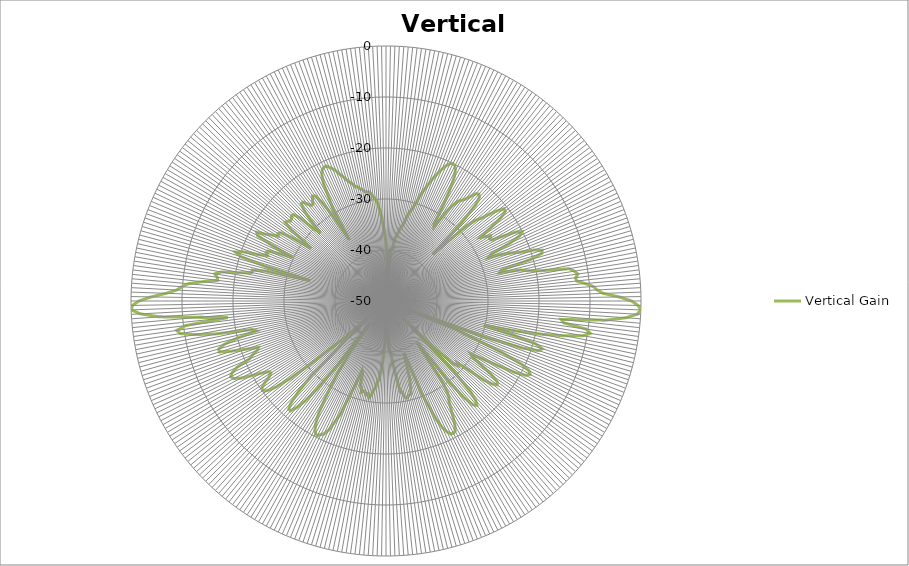
| Category | Vertical Gain |
|---|---|
| 0 | -38.65 |
| 1 | -40.9 |
| 2 | -42.72 |
| 3 | -45.24 |
| 4 | -43.29 |
| 5 | -42.2 |
| 6 | -40.06 |
| 7 | -39.79 |
| 8 | -37.65 |
| 9 | -37.22 |
| 10 | -36.46 |
| 11 | -35.47 |
| 12 | -35.03 |
| 13 | -34.24 |
| 14 | -32.79 |
| 15 | -31.89 |
| 16 | -31.13 |
| 17 | -29.9 |
| 18 | -28.16 |
| 19 | -26.88 |
| 20 | -25.56 |
| 21 | -24.2 |
| 22 | -23.07 |
| 23 | -21.92 |
| 24 | -20.94 |
| 25 | -20.27 |
| 26 | -20.04 |
| 27 | -20.2 |
| 28 | -21.03 |
| 29 | -22.54 |
| 30 | -25.25 |
| 31 | -28.61 |
| 32 | -32.25 |
| 33 | -32.7 |
| 34 | -28.99 |
| 35 | -26.95 |
| 36 | -25.77 |
| 37 | -25.26 |
| 38 | -24.6 |
| 39 | -23.56 |
| 40 | -22.53 |
| 41 | -22.24 |
| 42 | -22.63 |
| 43 | -24.22 |
| 44 | -28.56 |
| 45 | -37.03 |
| 46 | -33.48 |
| 47 | -28.42 |
| 48 | -26.29 |
| 49 | -25.28 |
| 50 | -23.5 |
| 51 | -21.83 |
| 52 | -20.63 |
| 53 | -20.7 |
| 54 | -22.04 |
| 55 | -24.86 |
| 56 | -27.71 |
| 57 | -26.84 |
| 58 | -25.83 |
| 59 | -26.32 |
| 60 | -26.06 |
| 61 | -23.8 |
| 62 | -21.26 |
| 63 | -20.08 |
| 64 | -20.81 |
| 65 | -23.24 |
| 66 | -27.39 |
| 67 | -28.22 |
| 68 | -25.68 |
| 69 | -23.73 |
| 70 | -22.08 |
| 71 | -19.3 |
| 72 | -17.79 |
| 73 | -18.04 |
| 74 | -20.54 |
| 75 | -26.58 |
| 76 | -27.07 |
| 77 | -23.01 |
| 78 | -21.53 |
| 79 | -18.79 |
| 80 | -13.5 |
| 81 | -12.61 |
| 82 | -12 |
| 83 | -12.55 |
| 84 | -12.42 |
| 85 | -10.78 |
| 86 | -9.26 |
| 87 | -8.55 |
| 88 | -7.36 |
| 89 | -4.24 |
| 90 | -1.85 |
| 91 | -0.57 |
| 92 | 0 |
| 93 | -0.66 |
| 94 | -2.86 |
| 95 | -6.84 |
| 96 | -15.47 |
| 97 | -14.89 |
| 98 | -10.34 |
| 99 | -9.45 |
| 100 | -10.79 |
| 101 | -14.22 |
| 102 | -18.5 |
| 103 | -23.87 |
| 104 | -30.24 |
| 105 | -24.04 |
| 106 | -19.48 |
| 107 | -17.96 |
| 108 | -18.52 |
| 109 | -21.7 |
| 110 | -29.23 |
| 111 | -46.14 |
| 112 | -35.67 |
| 113 | -31.28 |
| 114 | -24.84 |
| 115 | -20.63 |
| 116 | -18.79 |
| 117 | -18.28 |
| 118 | -18.96 |
| 119 | -21.12 |
| 120 | -24.67 |
| 121 | -28.11 |
| 122 | -30.4 |
| 123 | -29.6 |
| 124 | -27.26 |
| 125 | -24.7 |
| 126 | -23.02 |
| 127 | -22.7 |
| 128 | -23.56 |
| 129 | -25.35 |
| 130 | -29.28 |
| 131 | -31.53 |
| 132 | -31.02 |
| 133 | -31.82 |
| 134 | -36.45 |
| 135 | -45.29 |
| 136 | -31.23 |
| 137 | -25.68 |
| 138 | -23.68 |
| 139 | -22.87 |
| 140 | -23.42 |
| 141 | -25.4 |
| 142 | -29.72 |
| 143 | -39.78 |
| 144 | -37.45 |
| 145 | -30.96 |
| 146 | -28.59 |
| 147 | -27.29 |
| 148 | -26.65 |
| 149 | -25.25 |
| 150 | -23.62 |
| 151 | -22.14 |
| 152 | -21.1 |
| 153 | -20.89 |
| 154 | -20.99 |
| 155 | -21.7 |
| 156 | -22.83 |
| 157 | -24.78 |
| 158 | -27.99 |
| 159 | -30.87 |
| 160 | -37 |
| 161 | -39.21 |
| 162 | -37.21 |
| 163 | -34.09 |
| 164 | -32.68 |
| 165 | -31.19 |
| 166 | -31.02 |
| 167 | -30.81 |
| 168 | -30.54 |
| 169 | -30.76 |
| 170 | -31.89 |
| 171 | -31.95 |
| 172 | -34.25 |
| 173 | -36.31 |
| 174 | -38.15 |
| 175 | -39.96 |
| 176 | -40.53 |
| 177 | -43.68 |
| 178 | -47.7 |
| 179 | -46.5 |
| 180 | -44.71 |
| 181 | -42.41 |
| 182 | -41 |
| 183 | -38.11 |
| 184 | -36.59 |
| 185 | -34.72 |
| 186 | -34.07 |
| 187 | -32.87 |
| 188 | -32.35 |
| 189 | -31.23 |
| 190 | -30.73 |
| 191 | -31.51 |
| 192 | -31.18 |
| 193 | -31.71 |
| 194 | -31.83 |
| 195 | -31.49 |
| 196 | -32.49 |
| 197 | -32.82 |
| 198 | -35.1 |
| 199 | -35.6 |
| 200 | -32.82 |
| 201 | -30 |
| 202 | -25.95 |
| 203 | -24.11 |
| 204 | -22.26 |
| 205 | -21.25 |
| 206 | -20.86 |
| 207 | -20.4 |
| 208 | -20.53 |
| 209 | -21.29 |
| 210 | -22.61 |
| 211 | -24.43 |
| 212 | -27.53 |
| 213 | -30.53 |
| 214 | -33.65 |
| 215 | -38.13 |
| 216 | -44.58 |
| 217 | -34.46 |
| 218 | -28.28 |
| 219 | -24.71 |
| 220 | -22.69 |
| 221 | -21.44 |
| 222 | -21.52 |
| 223 | -22.72 |
| 224 | -25.33 |
| 225 | -29.45 |
| 226 | -39.87 |
| 227 | -49.52 |
| 228 | -38.82 |
| 229 | -37.69 |
| 230 | -31.46 |
| 231 | -25.94 |
| 232 | -22.56 |
| 233 | -20.75 |
| 234 | -20.12 |
| 235 | -20.26 |
| 236 | -21.31 |
| 237 | -22.68 |
| 238 | -23.39 |
| 239 | -23.07 |
| 240 | -21.69 |
| 241 | -19.79 |
| 242 | -17.78 |
| 243 | -16.54 |
| 244 | -16.1 |
| 245 | -16.69 |
| 246 | -18.02 |
| 247 | -20.89 |
| 248 | -21.79 |
| 249 | -22.95 |
| 250 | -23.39 |
| 251 | -20.99 |
| 252 | -18.16 |
| 253 | -15.82 |
| 254 | -15.88 |
| 255 | -17.18 |
| 256 | -20 |
| 257 | -23.97 |
| 258 | -23.09 |
| 259 | -16.27 |
| 260 | -12.03 |
| 261 | -9.15 |
| 262 | -8.56 |
| 263 | -10.41 |
| 264 | -18.82 |
| 265 | -13.24 |
| 266 | -5.49 |
| 267 | -1.78 |
| 268 | -0.02 |
| 269 | -0.27 |
| 270 | -1.55 |
| 271 | -3.96 |
| 272 | -6.86 |
| 273 | -8.89 |
| 274 | -9.87 |
| 275 | -11.1 |
| 276 | -13.81 |
| 277 | -16.76 |
| 278 | -16.61 |
| 279 | -16.01 |
| 280 | -17.2 |
| 281 | -21.01 |
| 282 | -23.11 |
| 283 | -23.08 |
| 284 | -25.79 |
| 285 | -34.59 |
| 286 | -25.39 |
| 287 | -20.24 |
| 288 | -18.92 |
| 289 | -20.32 |
| 290 | -23.47 |
| 291 | -25.1 |
| 292 | -24.64 |
| 293 | -24.9 |
| 294 | -27.31 |
| 295 | -29.78 |
| 296 | -25.13 |
| 297 | -21.77 |
| 298 | -21.28 |
| 299 | -22.96 |
| 300 | -24.07 |
| 301 | -25.36 |
| 302 | -25.05 |
| 303 | -25.45 |
| 304 | -27.79 |
| 305 | -32.03 |
| 306 | -29.84 |
| 307 | -26.62 |
| 308 | -24.92 |
| 309 | -25.12 |
| 310 | -25.59 |
| 311 | -25.44 |
| 312 | -25.07 |
| 313 | -25.17 |
| 314 | -26.44 |
| 315 | -29.99 |
| 316 | -31.49 |
| 317 | -28.18 |
| 318 | -25.86 |
| 319 | -24.68 |
| 320 | -24.69 |
| 321 | -25.53 |
| 322 | -26.23 |
| 323 | -26.22 |
| 324 | -25.46 |
| 325 | -24.89 |
| 326 | -25.17 |
| 327 | -26.81 |
| 328 | -30.15 |
| 329 | -35.95 |
| 330 | -29.32 |
| 331 | -26.98 |
| 332 | -23.9 |
| 333 | -22.31 |
| 334 | -21.43 |
| 335 | -21.13 |
| 336 | -21.04 |
| 337 | -21.52 |
| 338 | -22.03 |
| 339 | -22.69 |
| 340 | -23.58 |
| 341 | -24.22 |
| 342 | -25.02 |
| 343 | -25.67 |
| 344 | -26.08 |
| 345 | -26.86 |
| 346 | -26.9 |
| 347 | -27.45 |
| 348 | -27.63 |
| 349 | -28.15 |
| 350 | -28.28 |
| 351 | -28.32 |
| 352 | -28.72 |
| 353 | -29.44 |
| 354 | -29.84 |
| 355 | -30.63 |
| 356 | -32.01 |
| 357 | -33.47 |
| 358 | -35.36 |
| 359 | -36.43 |